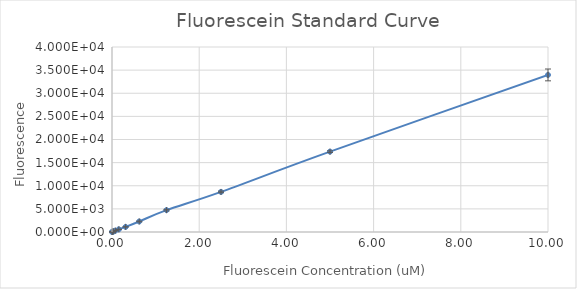
| Category | Series 0 |
|---|---|
| 10.0 | 33962 |
| 5.0 | 17370.75 |
| 2.5 | 8665.75 |
| 1.25 | 4728.25 |
| 0.625 | 2273.75 |
| 0.3125 | 1101.75 |
| 0.15625 | 579 |
| 0.078125 | 293.25 |
| 0.0390625 | 148.25 |
| 0.01953125 | 86.75 |
| 0.009765625 | 51.75 |
| 0.0 | 18.5 |